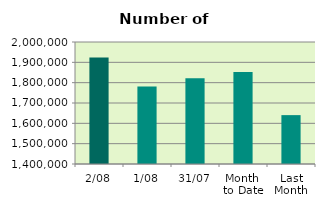
| Category | Series 0 |
|---|---|
| 2/08 | 1923798 |
| 1/08 | 1781394 |
| 31/07 | 1821512 |
| Month 
to Date | 1852596 |
| Last
Month | 1640369.455 |